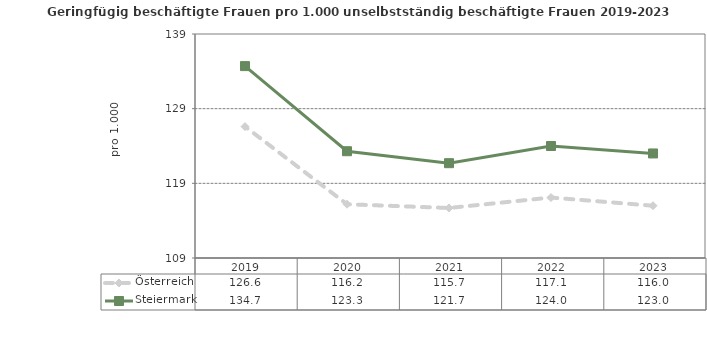
| Category | Österreich | Steiermark |
|---|---|---|
| 2023.0 | 116 | 123 |
| 2022.0 | 117.1 | 124 |
| 2021.0 | 115.7 | 121.7 |
| 2020.0 | 116.2 | 123.3 |
| 2019.0 | 126.6 | 134.7 |